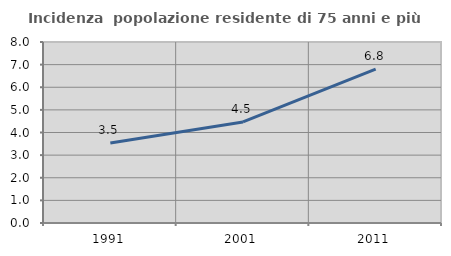
| Category | Incidenza  popolazione residente di 75 anni e più |
|---|---|
| 1991.0 | 3.535 |
| 2001.0 | 4.468 |
| 2011.0 | 6.801 |